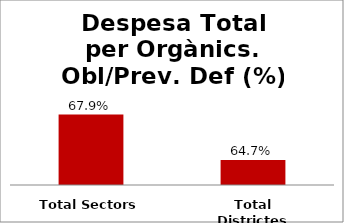
| Category | Series 0 |
|---|---|
| Total Sectors | 0.679 |
| Total Districtes | 0.647 |